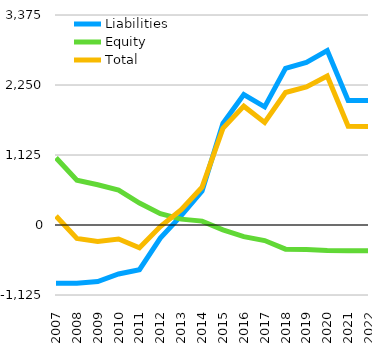
| Category | Liabilities  | Equity  | Total  |
|---|---|---|---|
| 2007 | -936 | 1080 | 144 |
| 2008 | -936 | 720 | -216 |
| 2009 | -909 | 646 | -263 |
| 2010 | -787 | 561 | -226 |
| 2011 | -718 | 352 | -366 |
| 2012 | -209 | 183 | -26 |
| 2013 | 151 | 94 | 245 |
| 2014 | 546 | 63 | 609 |
| 2015 | 1632 | -78 | 1554 |
| 2016 | 2097 | -187 | 1910 |
| 2017 | 1899 | -250 | 1649 |
| 2018 | 2518 | -388 | 2130 |
| 2019 | 2614 | -394 | 2220 |
| 2020 | 2805 | -410 | 2395 |
| 2021 | 2001.8 | -414 | 1587.8 |
| 2022 | 1999.8 | -415.1 | 1584.7 |